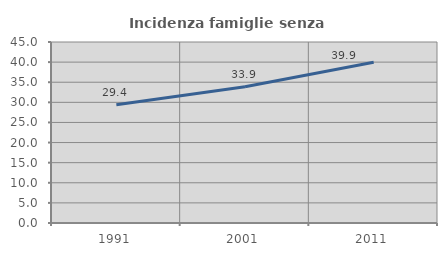
| Category | Incidenza famiglie senza nuclei |
|---|---|
| 1991.0 | 29.375 |
| 2001.0 | 33.879 |
| 2011.0 | 39.948 |